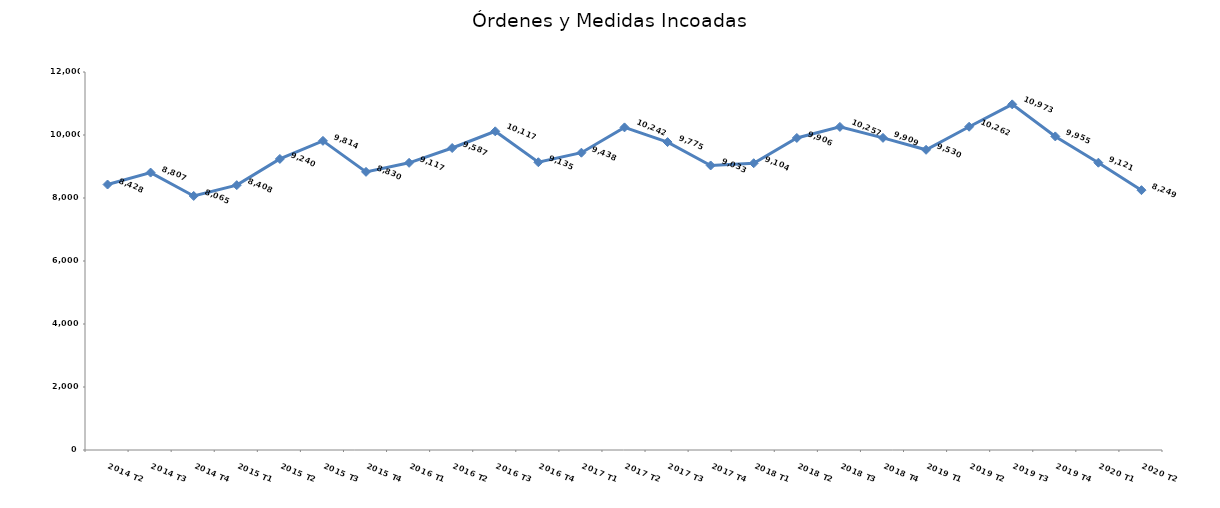
| Category | Series 0 |
|---|---|
| 2014 T2 | 8428 |
| 2014 T3 | 8807 |
| 2014 T4 | 8065 |
| 2015 T1 | 8408 |
| 2015 T2 | 9240 |
| 2015 T3 | 9814 |
| 2015 T4 | 8830 |
| 2016 T1 | 9117 |
| 2016 T2 | 9587 |
| 2016 T3 | 10117 |
| 2016 T4 | 9135 |
| 2017 T1 | 9438 |
| 2017 T2 | 10242 |
| 2017 T3 | 9775 |
| 2017 T4 | 9033 |
| 2018 T1 | 9104 |
| 2018 T2 | 9906 |
| 2018 T3 | 10257 |
| 2018 T4 | 9909 |
| 2019 T1 | 9530 |
| 2019 T2 | 10262 |
| 2019 T3 | 10973 |
| 2019 T4 | 9955 |
| 2020 T1 | 9121 |
| 2020 T2 | 8249 |